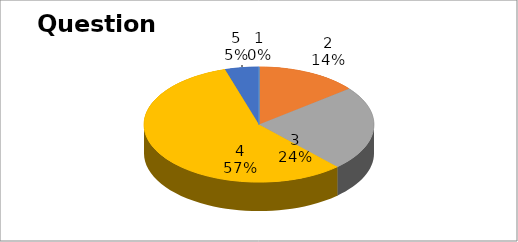
| Category | Series 0 |
|---|---|
| 0 | 0 |
| 1 | 3 |
| 2 | 5 |
| 3 | 12 |
| 4 | 1 |